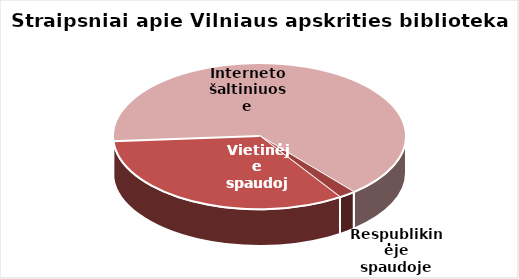
| Category | Series 0 |
|---|---|
| Respublikinėje spaudoje | 38 |
| Vietinėje spaudoje | 679 |
| Interneto šaltiniuose | 1332 |